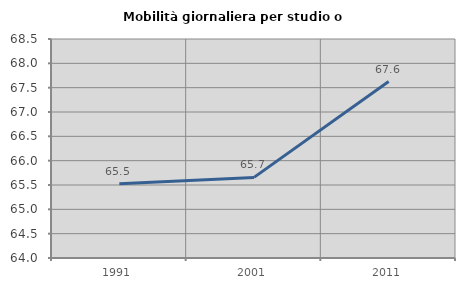
| Category | Mobilità giornaliera per studio o lavoro |
|---|---|
| 1991.0 | 65.525 |
| 2001.0 | 65.657 |
| 2011.0 | 67.626 |